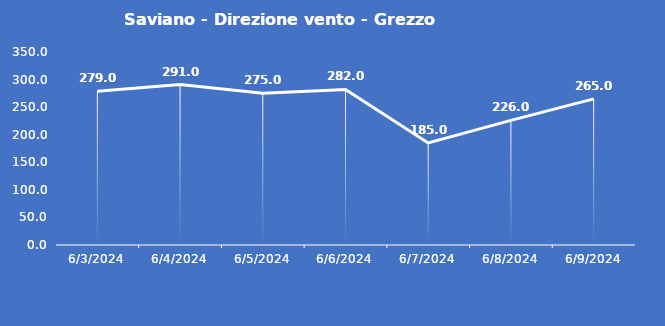
| Category | Saviano - Direzione vento - Grezzo (°N) |
|---|---|
| 6/3/24 | 279 |
| 6/4/24 | 291 |
| 6/5/24 | 275 |
| 6/6/24 | 282 |
| 6/7/24 | 185 |
| 6/8/24 | 226 |
| 6/9/24 | 265 |